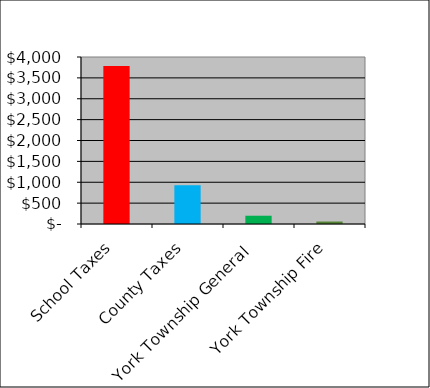
| Category | Series 0 |
|---|---|
| School Taxes | 3783.352 |
| County Taxes | 927.449 |
| York Township General  | 198.282 |
| York Township Fire | 59.165 |